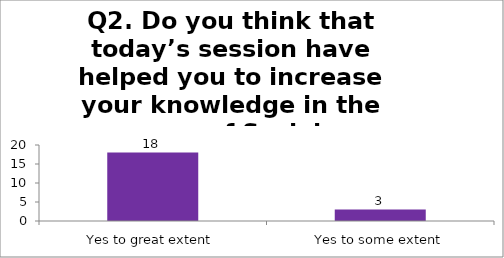
| Category | Q2. Do you think that today’s session have helped you to increase your knowledge in the area of Social Entrepreneurship? |
|---|---|
| Yes to great extent | 18 |
| Yes to some extent | 3 |